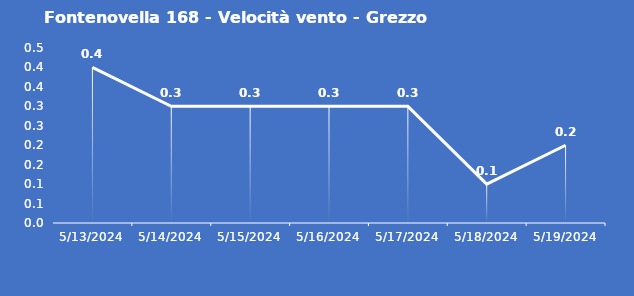
| Category | Fontenovella 168 - Velocità vento - Grezzo (m/s) |
|---|---|
| 5/13/24 | 0.4 |
| 5/14/24 | 0.3 |
| 5/15/24 | 0.3 |
| 5/16/24 | 0.3 |
| 5/17/24 | 0.3 |
| 5/18/24 | 0.1 |
| 5/19/24 | 0.2 |